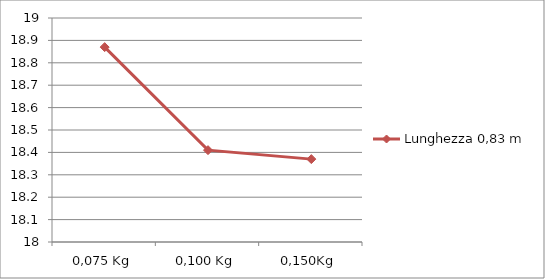
| Category | Lunghezza 0,83 m |
|---|---|
| 0,075 Kg | 18.87 |
| 0,100 Kg | 18.41 |
| 0,150Kg | 18.37 |